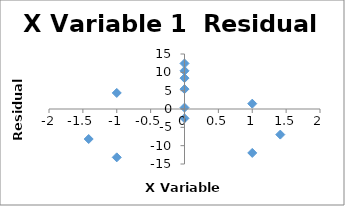
| Category | Series 0 |
|---|---|
| -1.0 | -13.188 |
| 1.0 | 1.454 |
| -1.0 | 4.379 |
| 1.0 | -11.979 |
| -1.414 | -8.19 |
| 1.414 | -6.976 |
| 0.0 | 0.379 |
| 0.0 | -2.545 |
| 0.0 | 5.417 |
| 0.0 | 8.417 |
| 0.0 | 12.417 |
| 0.0 | 10.417 |